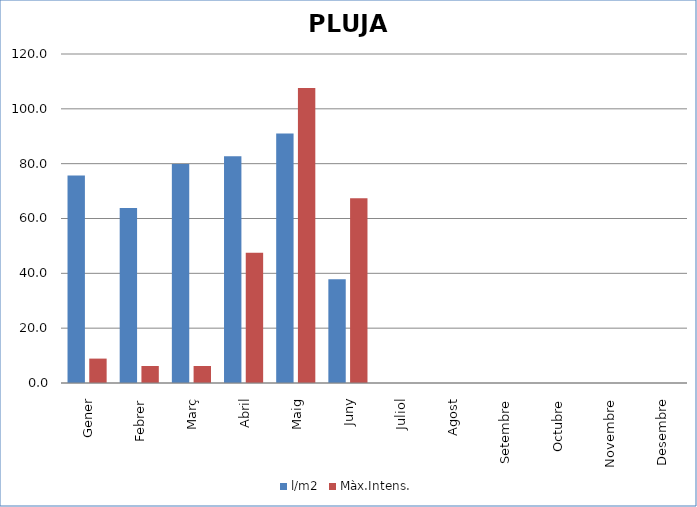
| Category | l/m2 | Màx.Intens. |
|---|---|---|
| Gener | 75.7 | 8.9 |
| Febrer | 63.8 | 6.2 |
| Març | 79.89 | 6.2 |
| Abril | 82.75 | 47.5 |
| Maig | 91 | 107.6 |
| Juny | 37.8 | 67.4 |
| Juliol | 0 | 0 |
| Agost | 0 | 0 |
| Setembre | 0 | 0 |
| Octubre | 0 | 0 |
| Novembre | 0 | 0 |
| Desembre | 0 | 0 |